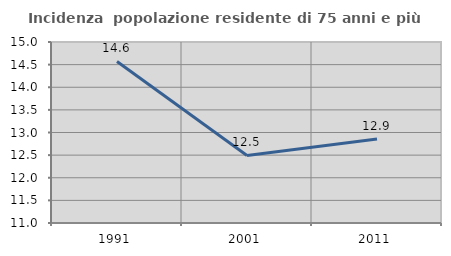
| Category | Incidenza  popolazione residente di 75 anni e più |
|---|---|
| 1991.0 | 14.57 |
| 2001.0 | 12.493 |
| 2011.0 | 12.859 |